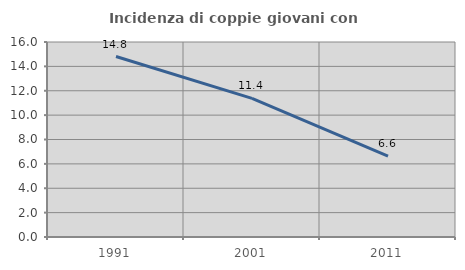
| Category | Incidenza di coppie giovani con figli |
|---|---|
| 1991.0 | 14.806 |
| 2001.0 | 11.372 |
| 2011.0 | 6.632 |